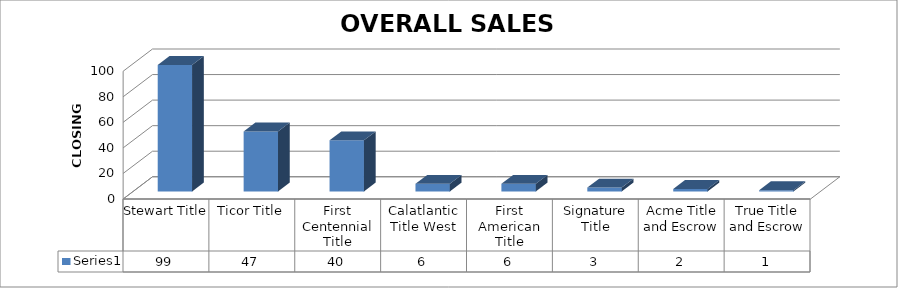
| Category | Series 0 |
|---|---|
| Stewart Title | 99 |
| Ticor Title | 47 |
| First Centennial Title | 40 |
| Calatlantic Title West | 6 |
| First American Title | 6 |
| Signature Title | 3 |
| Acme Title and Escrow | 2 |
| True Title and Escrow | 1 |